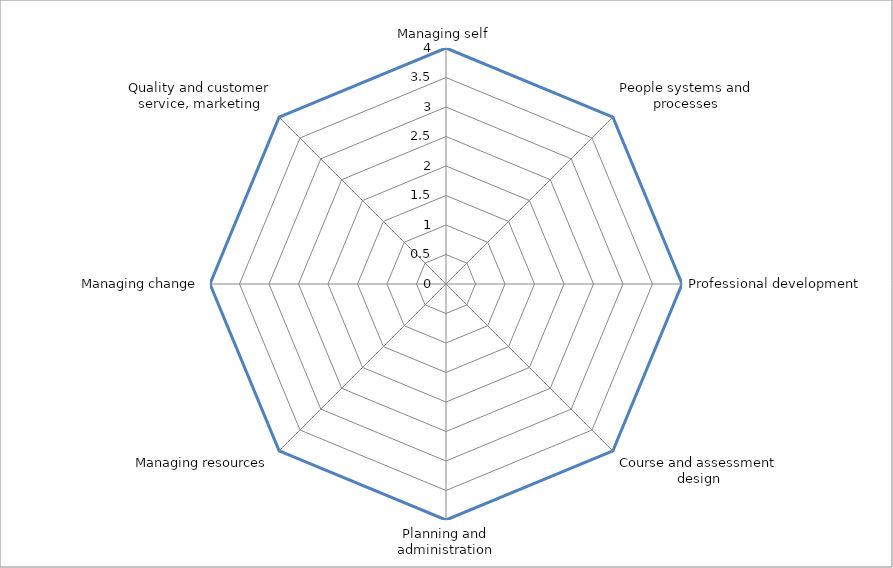
| Category | Series 0 | Series 1 |
|---|---|---|
| Managing self | 4 | 0 |
| People systems and processes | 4 | 0 |
| Professional development | 4 | 0 |
| Course and assessment design | 4 | 0 |
| Planning and administration | 4 | 0 |
| Managing resources | 4 | 0 |
| Managing change | 4 | 0 |
| Quality and customer service, marketing | 4 | 0 |